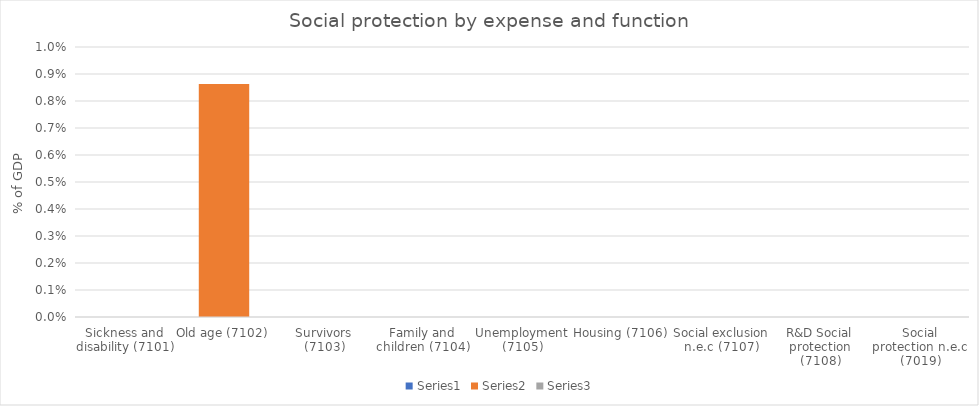
| Category | Series 0 | Series 1 | Series 2 |
|---|---|---|---|
| Sickness and disability (7101) | 0 | 0 | 0 |
| Old age (7102) | 0 | 0.009 | 0 |
| Survivors (7103) | 0 | 0 | 0 |
| Family and children (7104) | 0 | 0 | 0 |
| Unemployment (7105) | 0 | 0 | 0 |
| Housing (7106) | 0 | 0 | 0 |
| Social exclusion n.e.c (7107) | 0 | 0 | 0 |
| R&D Social protection (7108) | 0 | 0 | 0 |
| Social protection n.e.c (7019) | 0 | 0 | 0 |